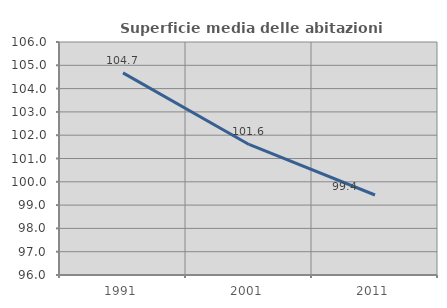
| Category | Superficie media delle abitazioni occupate |
|---|---|
| 1991.0 | 104.673 |
| 2001.0 | 101.602 |
| 2011.0 | 99.434 |